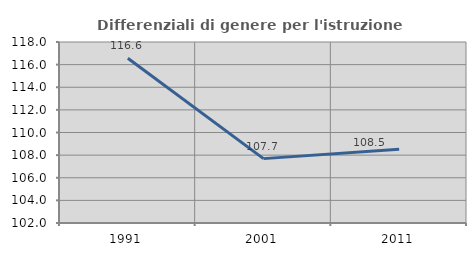
| Category | Differenziali di genere per l'istruzione superiore |
|---|---|
| 1991.0 | 116.564 |
| 2001.0 | 107.691 |
| 2011.0 | 108.514 |